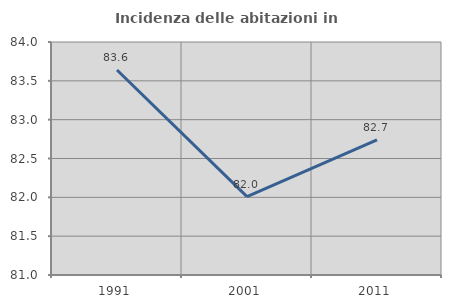
| Category | Incidenza delle abitazioni in proprietà  |
|---|---|
| 1991.0 | 83.639 |
| 2001.0 | 82.009 |
| 2011.0 | 82.741 |